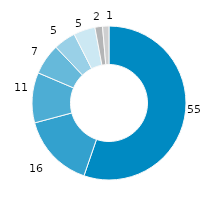
| Category | Bayern |
|---|---|
| gesetzliche
Kranken-versicherung | 55.273 |
| private Haushalte u. private Organi-sationen o. E. | 15.571 |
| private
Kranken-versicherung | 10.561 |
| soziale Pflegeversicherung | 6.503 |
| öffentliche Haushalte | 4.635 |
| Arbeitgeber | 4.519 |
| gesetzliche Unfallversicherung | 1.599 |
| gesetzliche
Renten-
versicherung | 1.338 |